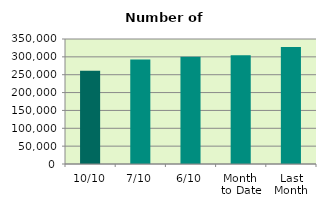
| Category | Series 0 |
|---|---|
| 10/10 | 260852 |
| 7/10 | 292450 |
| 6/10 | 300162 |
| Month 
to Date | 304496.333 |
| Last
Month | 327317.909 |